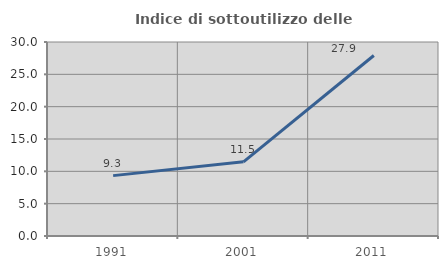
| Category | Indice di sottoutilizzo delle abitazioni  |
|---|---|
| 1991.0 | 9.337 |
| 2001.0 | 11.466 |
| 2011.0 | 27.914 |